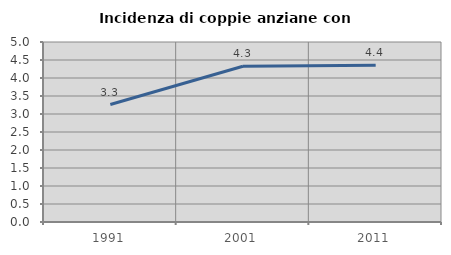
| Category | Incidenza di coppie anziane con figli |
|---|---|
| 1991.0 | 3.264 |
| 2001.0 | 4.326 |
| 2011.0 | 4.357 |